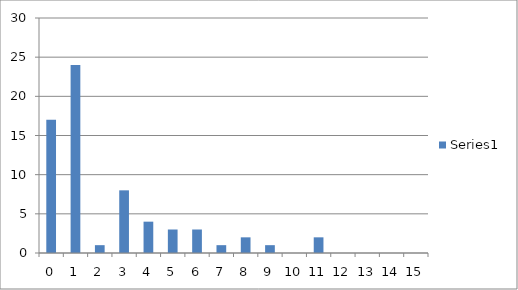
| Category | Series 0 |
|---|---|
| 0.0 | 17 |
| 1.0 | 24 |
| 2.0 | 1 |
| 3.0 | 8 |
| 4.0 | 4 |
| 5.0 | 3 |
| 6.0 | 3 |
| 7.0 | 1 |
| 8.0 | 2 |
| 9.0 | 1 |
| 10.0 | 0 |
| 11.0 | 2 |
| 12.0 | 0 |
| 13.0 | 0 |
| 14.0 | 0 |
| 15.0 | 0 |